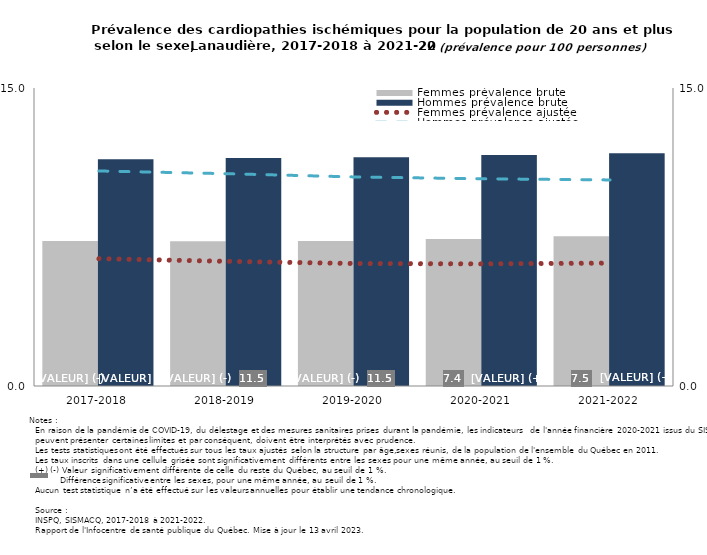
| Category | Femmes prévalence brute | Hommes prévalence brute |
|---|---|---|
| 2017-2018 | 7.295 | 11.409 |
| 2018-2019 | 7.284 | 11.481 |
| 2019-2020 | 7.294 | 11.519 |
| 2020-2021 | 7.397 | 11.632 |
| 2021-2022 | 7.538 | 11.709 |